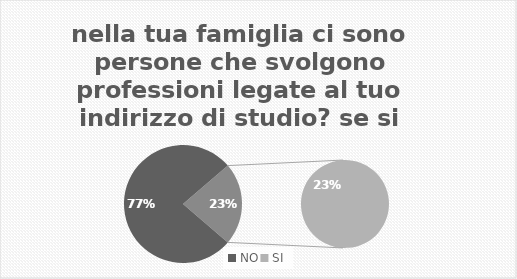
| Category | Series 0 |
|---|---|
| NO | 0.775 |
| SI | 0.225 |